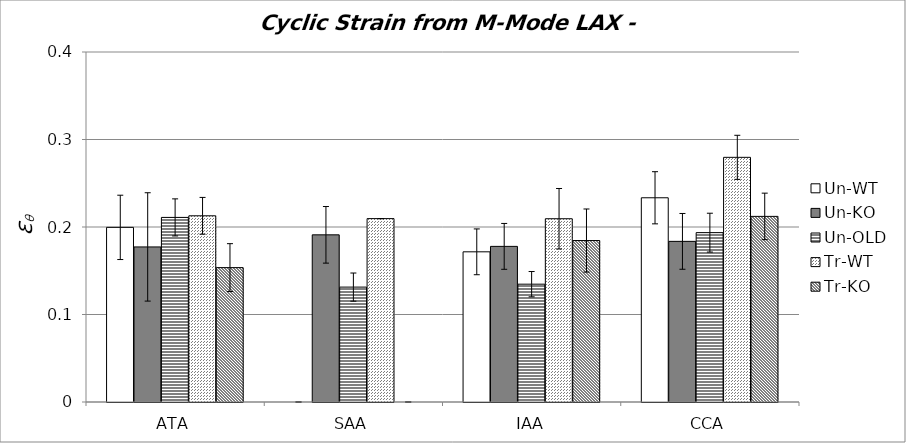
| Category | Un-WT | Un-KO | Un-OLD | Tr-WT | Tr-KO |
|---|---|---|---|---|---|
| 0 | 0.2 | 0.177 | 0.211 | 0.213 | 0.154 |
| 1 | 0 | 0.191 | 0.131 | 0.21 | 0 |
| 2 | 0.172 | 0.178 | 0.135 | 0.209 | 0.185 |
| 3 | 0.233 | 0.184 | 0.194 | 0.28 | 0.212 |